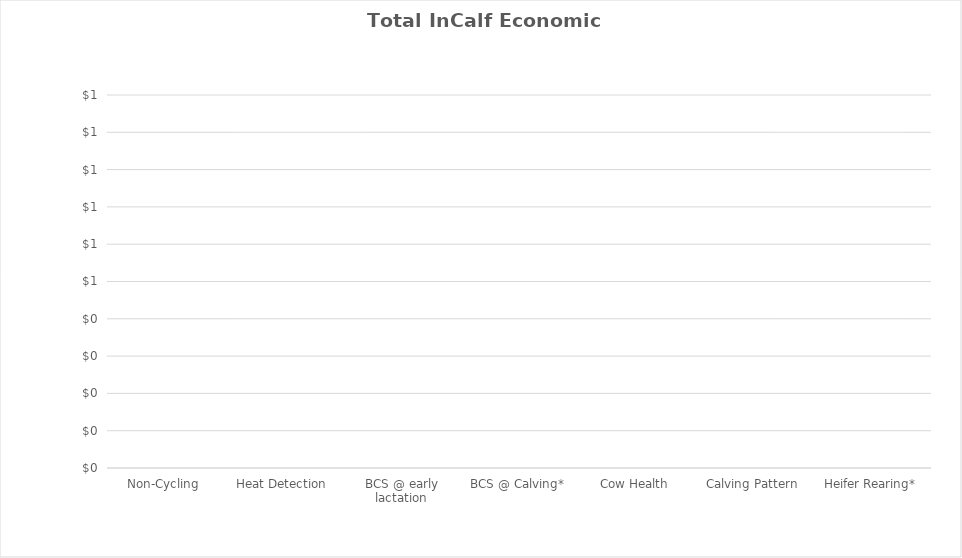
| Category | Total InCalf Economic Gap |
|---|---|
| Non-Cycling | 0 |
| Heat Detection | 0 |
| BCS @ early lactation | 0 |
| BCS @ Calving* | 0 |
| Cow Health | 0 |
| Calving Pattern | 0 |
| Heifer Rearing* | 0 |